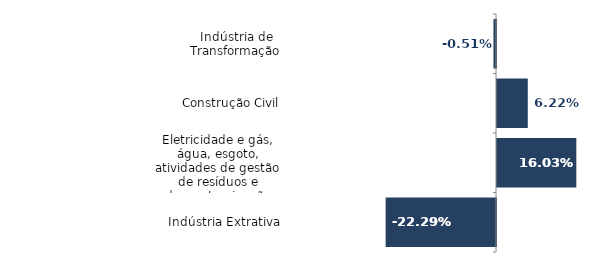
| Category | Series 0 |
|---|---|
| Indústria de Transformação | -0.005 |
| Construção Civil | 0.062 |
| Eletricidade e gás, água, esgoto, atividades de gestão de resíduos e descontaminação | 0.16 |
| Indústria Extrativa | -0.223 |